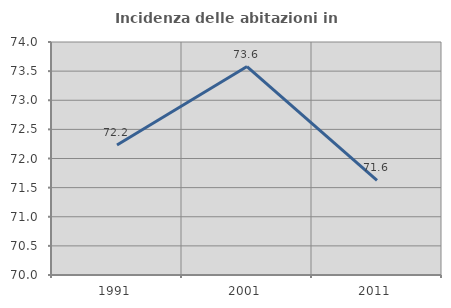
| Category | Incidenza delle abitazioni in proprietà  |
|---|---|
| 1991.0 | 72.231 |
| 2001.0 | 73.578 |
| 2011.0 | 71.626 |